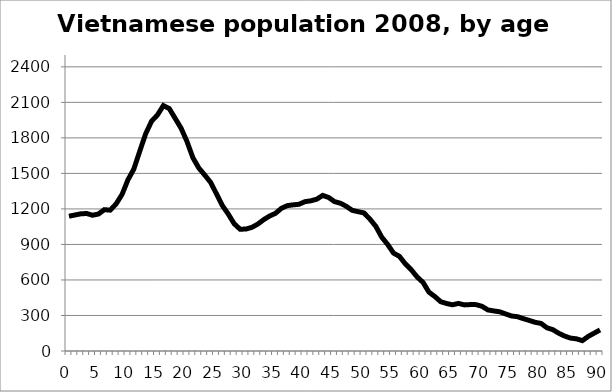
| Category | popsm |
|---|---|
| 0.0 | 1138.527 |
| 1.0 | 1148.621 |
| 2.0 | 1158.714 |
| 3.0 | 1161.405 |
| 4.0 | 1146.602 |
| 5.0 | 1156.919 |
| 6.0 | 1193.704 |
| 7.0 | 1189.667 |
| 8.0 | 1243.049 |
| 9.0 | 1322.45 |
| 10.0 | 1446.261 |
| 11.0 | 1536.877 |
| 12.0 | 1687.604 |
| 13.0 | 1834.742 |
| 14.0 | 1940.61 |
| 15.0 | 1993.544 |
| 16.0 | 2072.945 |
| 17.0 | 2047.375 |
| 18.0 | 1964.834 |
| 19.0 | 1881.845 |
| 20.0 | 1769.696 |
| 21.0 | 1632.876 |
| 22.0 | 1545.849 |
| 23.0 | 1486.635 |
| 24.0 | 1424.729 |
| 25.0 | 1326.936 |
| 26.0 | 1228.246 |
| 27.0 | 1156.022 |
| 28.0 | 1074.827 |
| 29.0 | 1028.622 |
| 30.0 | 1029.968 |
| 31.0 | 1044.323 |
| 32.0 | 1071.687 |
| 33.0 | 1109.369 |
| 34.0 | 1139.873 |
| 35.0 | 1162.751 |
| 36.0 | 1204.919 |
| 37.0 | 1227.797 |
| 38.0 | 1234.526 |
| 39.0 | 1239.46 |
| 40.0 | 1261.441 |
| 41.0 | 1268.619 |
| 42.0 | 1282.525 |
| 43.0 | 1313.927 |
| 44.0 | 1296.88 |
| 45.0 | 1261.89 |
| 46.0 | 1247.984 |
| 47.0 | 1221.965 |
| 48.0 | 1188.321 |
| 49.0 | 1176.658 |
| 50.0 | 1165.891 |
| 51.0 | 1114.303 |
| 52.0 | 1052.846 |
| 53.0 | 961.782 |
| 54.0 | 900.325 |
| 55.0 | 827.204 |
| 56.0 | 799.391 |
| 57.0 | 736.14 |
| 58.0 | 686.795 |
| 59.0 | 625.338 |
| 60.0 | 579.581 |
| 61.0 | 497.04 |
| 62.0 | 460.256 |
| 63.0 | 416.294 |
| 64.0 | 401.041 |
| 65.0 | 390.275 |
| 66.0 | 401.939 |
| 67.0 | 389.378 |
| 68.0 | 392.07 |
| 69.0 | 391.621 |
| 70.0 | 377.266 |
| 71.0 | 346.762 |
| 72.0 | 338.239 |
| 73.0 | 331.061 |
| 74.0 | 313.117 |
| 75.0 | 295.622 |
| 76.0 | 289.791 |
| 77.0 | 273.193 |
| 78.0 | 258.389 |
| 79.0 | 242.24 |
| 80.0 | 232.819 |
| 81.0 | 196.035 |
| 82.0 | 180.334 |
| 83.0 | 149.83 |
| 84.0 | 126.054 |
| 85.0 | 109.008 |
| 86.0 | 102.728 |
| 87.0 | 87.475 |
| 88.0 | 123.363 |
| 89.0 | 150.727 |
| 90.0 | 178.091 |